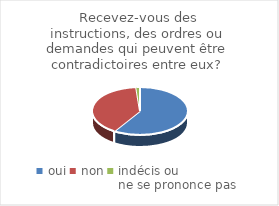
| Category | Recevez-vous des instructions, des ordres ou demandes qui peuvent être contradictoires entre eux? |
|---|---|
| oui | 46 |
| non | 31 |
| indécis ou 
ne se prononce pas | 1 |